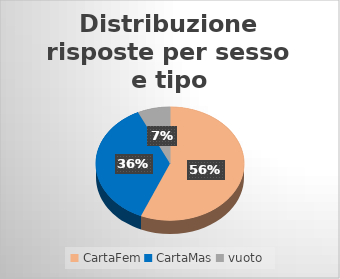
| Category | Distribuzione risposte per sesso e tipo | Series 1 |
|---|---|---|
| CartaFem | 119 | 0.394 |
| CartaMas | 77 | 0.255 |
| vuoto | 15 | 0.05 |